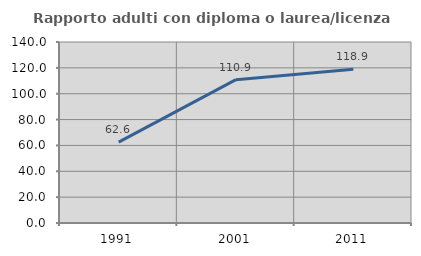
| Category | Rapporto adulti con diploma o laurea/licenza media  |
|---|---|
| 1991.0 | 62.557 |
| 2001.0 | 110.853 |
| 2011.0 | 118.909 |